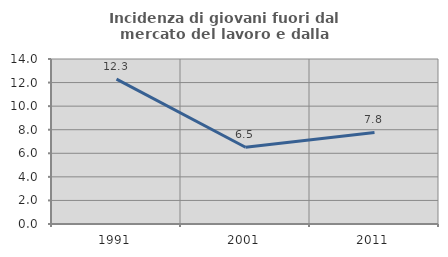
| Category | Incidenza di giovani fuori dal mercato del lavoro e dalla formazione  |
|---|---|
| 1991.0 | 12.298 |
| 2001.0 | 6.508 |
| 2011.0 | 7.767 |